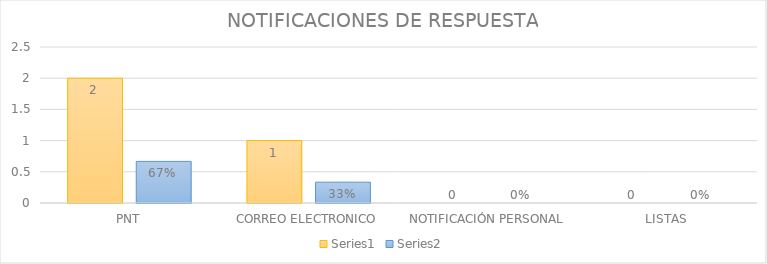
| Category | Series 3 | Series 4 |
|---|---|---|
| PNT | 2 | 0.667 |
| CORREO ELECTRONICO | 1 | 0.333 |
| NOTIFICACIÓN PERSONAL | 0 | 0 |
| LISTAS | 0 | 0 |